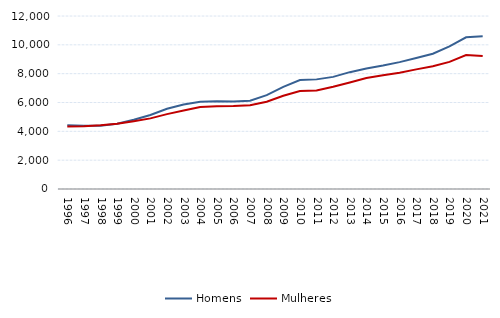
| Category | Homens | Mulheres |
|---|---|---|
| 1996.0 | 4417 | 4342 |
| 1997.0 | 4386 | 4355 |
| 1998.0 | 4390 | 4415 |
| 1999.0 | 4520 | 4532 |
| 2000.0 | 4804 | 4705 |
| 2001.0 | 5132 | 4898 |
| 2002.0 | 5567 | 5195 |
| 2003.0 | 5859 | 5441 |
| 2004.0 | 6049 | 5680 |
| 2005.0 | 6085 | 5748 |
| 2006.0 | 6064 | 5759 |
| 2007.0 | 6128 | 5812 |
| 2008.0 | 6511 | 6058 |
| 2009.0 | 7081 | 6472 |
| 2010.0 | 7562 | 6794 |
| 2011.0 | 7604 | 6826 |
| 2012.0 | 7778 | 7090 |
| 2013.0 | 8105 | 7381 |
| 2014.0 | 8358 | 7696 |
| 2015.0 | 8564 | 7892 |
| 2016.0 | 8800 | 8068 |
| 2017.0 | 9086 | 8298 |
| 2018.0 | 9382 | 8511 |
| 2019.0 | 9894 | 8819 |
| 2020.0 | 10525 | 9295 |
| 2021.0 | 10587 | 9229 |